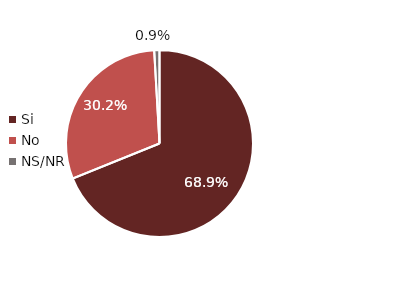
| Category | % |
|---|---|
| Si | 0.689 |
| No | 0.302 |
| NS/NR | 0.009 |